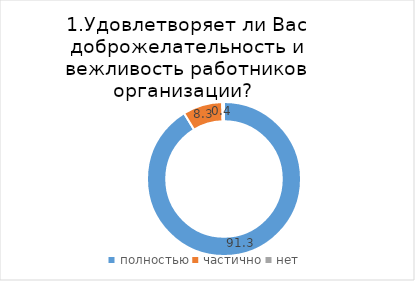
| Category | Томск |
|---|---|
| полностью | 91.324 |
| частично | 8.31 |
| нет | 0.366 |